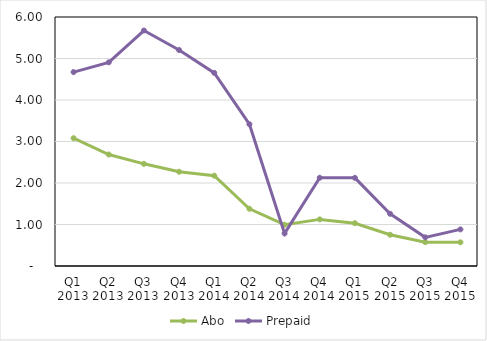
| Category | Abo | Prepaid |
|---|---|---|
| Q1 2013 | 3.08 | 4.672 |
| Q2 2013 | 2.687 | 4.907 |
| Q3 2013 | 2.462 | 5.674 |
| Q4 2013 | 2.271 | 5.204 |
| Q1 2014 | 2.176 | 4.654 |
| Q2 2014 | 1.38 | 3.416 |
| Q3 2014 | 0.994 | 0.785 |
| Q4 2014 | 1.123 | 2.127 |
| Q1 2015 | 1.031 | 2.124 |
| Q2 2015 | 0.753 | 1.258 |
| Q3 2015 | 0.575 | 0.69 |
| Q4 2015 | 0.571 | 0.882 |